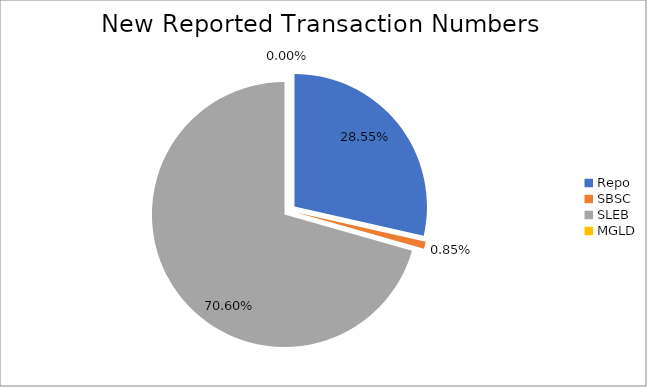
| Category | Series 0 |
|---|---|
| Repo | 312356 |
| SBSC | 9308 |
| SLEB | 772369 |
| MGLD | 24 |